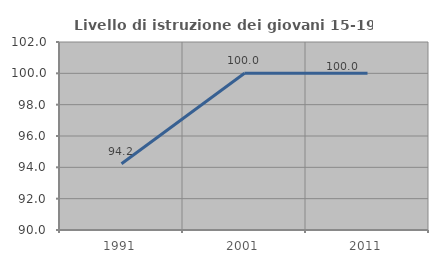
| Category | Livello di istruzione dei giovani 15-19 anni |
|---|---|
| 1991.0 | 94.231 |
| 2001.0 | 100 |
| 2011.0 | 100 |